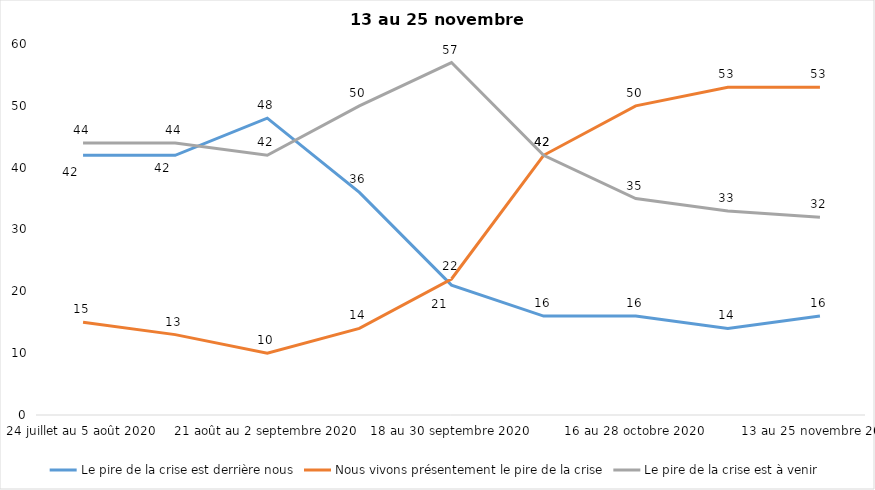
| Category | Le pire de la crise est derrière nous | Nous vivons présentement le pire de la crise | Le pire de la crise est à venir |
|---|---|---|---|
| 24 juillet au 5 août 2020 | 42 | 15 | 44 |
| 7 au 19 août 2020 | 42 | 13 | 44 |
| 21 août au 2 septembre 2020 | 48 | 10 | 42 |
| 4 au 16 septembre 2020 | 36 | 14 | 50 |
| 18 au 30 septembre 2020 | 21 | 22 | 57 |
| 2 au 14 octobre 2020 | 16 | 42 | 42 |
| 16 au 28 octobre 2020 | 16 | 50 | 35 |
| 30 octobre au 11 novembre 2020 | 14 | 53 | 33 |
| 13 au 25 novembre 2020 | 16 | 53 | 32 |